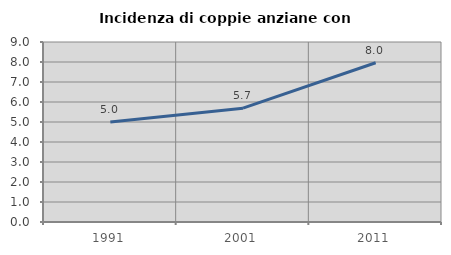
| Category | Incidenza di coppie anziane con figli |
|---|---|
| 1991.0 | 5 |
| 2001.0 | 5.691 |
| 2011.0 | 7.965 |